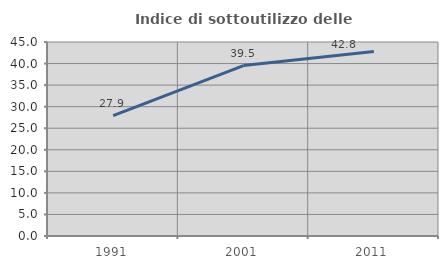
| Category | Indice di sottoutilizzo delle abitazioni  |
|---|---|
| 1991.0 | 27.923 |
| 2001.0 | 39.529 |
| 2011.0 | 42.781 |